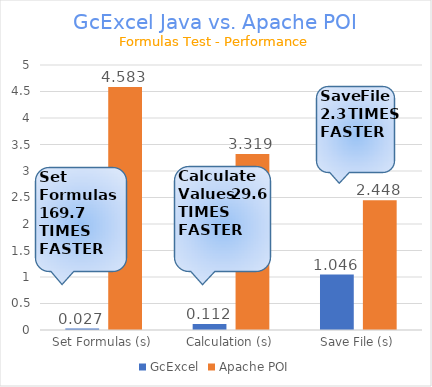
| Category | GcExcel | Apache POI |
|---|---|---|
| Set Formulas (s) | 0.027 | 4.583 |
| Calculation (s) | 0.112 | 3.319 |
| Save File (s) | 1.046 | 2.448 |